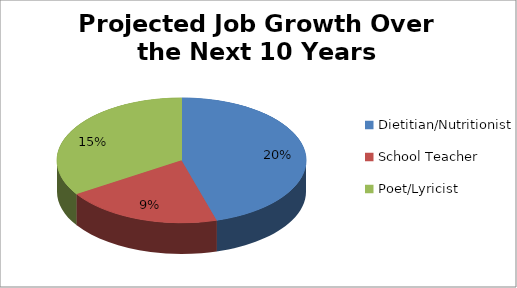
| Category | Projected Job Growth over next 10 years Percentage Growth |
|---|---|
| Dietitian/Nutritionist | 0.2 |
| School Teacher | 0.09 |
| Poet/Lyricist | 0.15 |